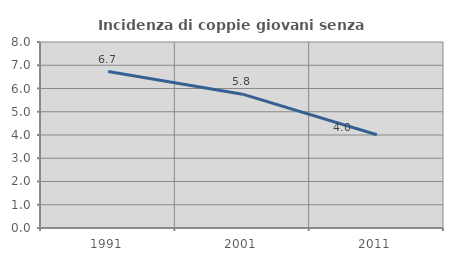
| Category | Incidenza di coppie giovani senza figli |
|---|---|
| 1991.0 | 6.727 |
| 2001.0 | 5.757 |
| 2011.0 | 4.012 |